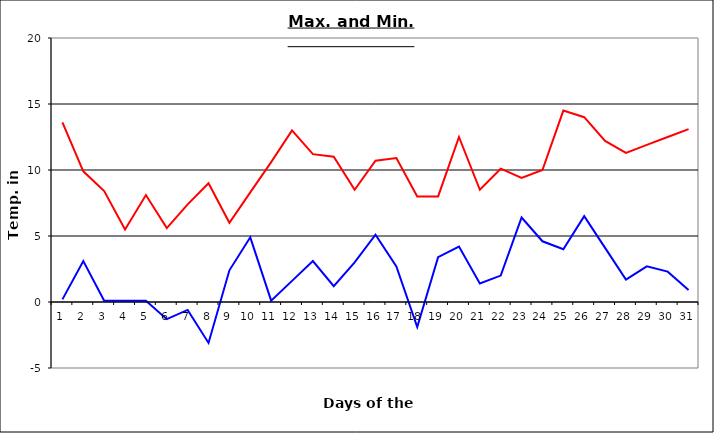
| Category | Series 0 | Series 1 |
|---|---|---|
| 0 | 13.6 | 0.2 |
| 1 | 9.9 | 3.1 |
| 2 | 8.4 | 0.1 |
| 3 | 5.5 | 0.1 |
| 4 | 8.1 | 0.1 |
| 5 | 5.6 | -1.3 |
| 6 | 7.4 | -0.6 |
| 7 | 9 | -3.1 |
| 8 | 6 | 2.4 |
| 9 | 8.3 | 4.9 |
| 10 | 10.6 | 0.1 |
| 11 | 13 | 1.6 |
| 12 | 11.2 | 3.1 |
| 13 | 11 | 1.2 |
| 14 | 8.5 | 3 |
| 15 | 10.7 | 5.1 |
| 16 | 10.9 | 2.7 |
| 17 | 8 | -1.9 |
| 18 | 8 | 3.4 |
| 19 | 12.5 | 4.2 |
| 20 | 8.5 | 1.4 |
| 21 | 10.1 | 2 |
| 22 | 9.4 | 6.4 |
| 23 | 10 | 4.6 |
| 24 | 14.5 | 4 |
| 25 | 14 | 6.5 |
| 26 | 12.2 | 4.1 |
| 27 | 11.3 | 1.7 |
| 28 | 11.9 | 2.7 |
| 29 | 12.5 | 2.3 |
| 30 | 13.1 | 0.9 |